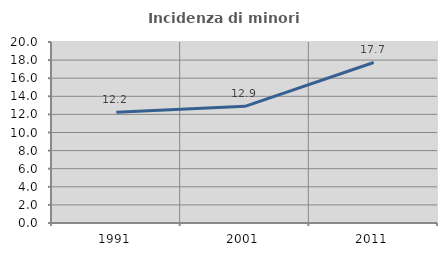
| Category | Incidenza di minori stranieri |
|---|---|
| 1991.0 | 12.226 |
| 2001.0 | 12.889 |
| 2011.0 | 17.735 |